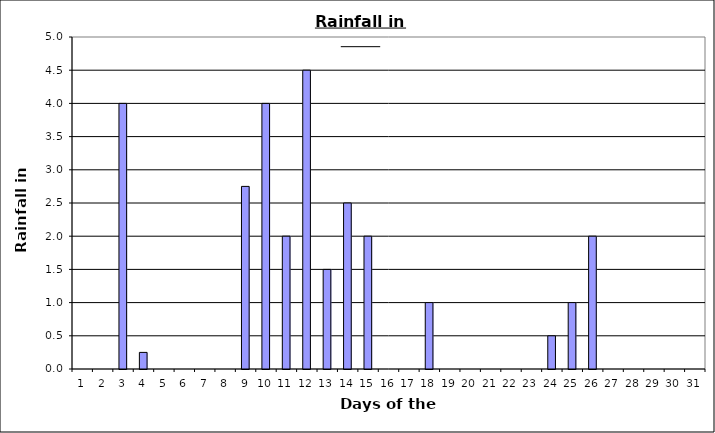
| Category | Series 0 |
|---|---|
| 0 | 0 |
| 1 | 0 |
| 2 | 4 |
| 3 | 0.25 |
| 4 | 0 |
| 5 | 0 |
| 6 | 0 |
| 7 | 0 |
| 8 | 2.75 |
| 9 | 4 |
| 10 | 2 |
| 11 | 4.5 |
| 12 | 1.5 |
| 13 | 2.5 |
| 14 | 2 |
| 15 | 0 |
| 16 | 0 |
| 17 | 1 |
| 18 | 0 |
| 19 | 0 |
| 20 | 0 |
| 21 | 0 |
| 22 | 0 |
| 23 | 0.5 |
| 24 | 1 |
| 25 | 2 |
| 26 | 0 |
| 27 | 0 |
| 28 | 0 |
| 29 | 0 |
| 30 | 0 |